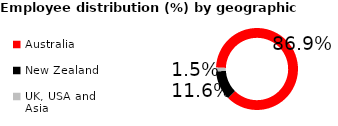
| Category | Series 0 |
|---|---|
| Australia | 0.869 |
| New Zealand | 0.116 |
| UK, USA and Asia | 0.015 |